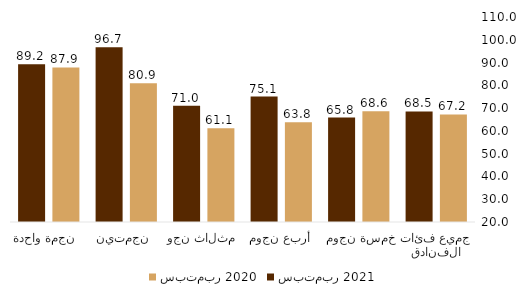
| Category | سبتمبر 2020 | سبتمبر 2021 |
|---|---|---|
| جميع فئات الفنادق | 67.24 | 68.519 |
|  خمسة نجوم  | 68.6 | 65.826 |
| أربع نجوم | 63.765 | 75.081 |
| ثلاث نجوم  | 61.121 | 70.984 |
| نجمتين  | 80.891 | 96.668 |
| نجمة واحدة  | 87.882 | 89.227 |